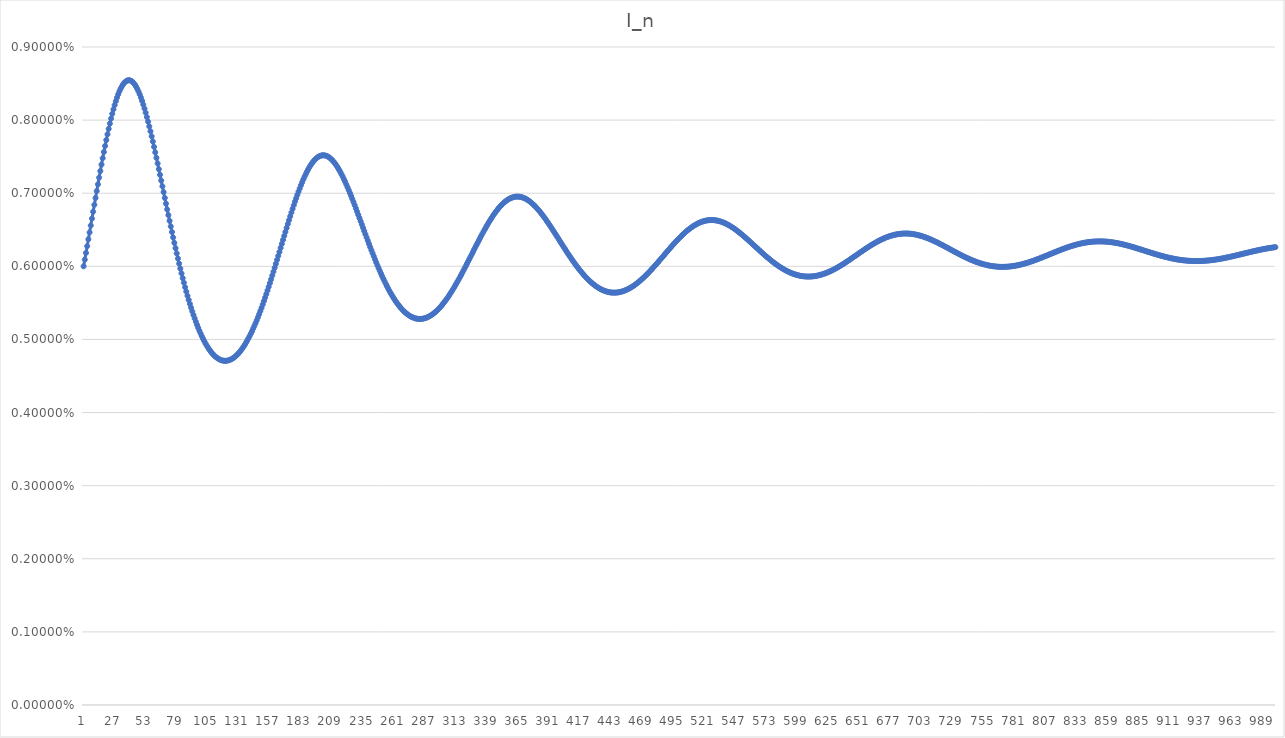
| Category | I_n |
|---|---|
| 0 | 0.006 |
| 1 | 0.006 |
| 2 | 0.006 |
| 3 | 0.006 |
| 4 | 0.006 |
| 5 | 0.006 |
| 6 | 0.007 |
| 7 | 0.007 |
| 8 | 0.007 |
| 9 | 0.007 |
| 10 | 0.007 |
| 11 | 0.007 |
| 12 | 0.007 |
| 13 | 0.007 |
| 14 | 0.007 |
| 15 | 0.007 |
| 16 | 0.007 |
| 17 | 0.008 |
| 18 | 0.008 |
| 19 | 0.008 |
| 20 | 0.008 |
| 21 | 0.008 |
| 22 | 0.008 |
| 23 | 0.008 |
| 24 | 0.008 |
| 25 | 0.008 |
| 26 | 0.008 |
| 27 | 0.008 |
| 28 | 0.008 |
| 29 | 0.008 |
| 30 | 0.008 |
| 31 | 0.008 |
| 32 | 0.008 |
| 33 | 0.008 |
| 34 | 0.009 |
| 35 | 0.009 |
| 36 | 0.009 |
| 37 | 0.009 |
| 38 | 0.009 |
| 39 | 0.009 |
| 40 | 0.009 |
| 41 | 0.009 |
| 42 | 0.009 |
| 43 | 0.008 |
| 44 | 0.008 |
| 45 | 0.008 |
| 46 | 0.008 |
| 47 | 0.008 |
| 48 | 0.008 |
| 49 | 0.008 |
| 50 | 0.008 |
| 51 | 0.008 |
| 52 | 0.008 |
| 53 | 0.008 |
| 54 | 0.008 |
| 55 | 0.008 |
| 56 | 0.008 |
| 57 | 0.008 |
| 58 | 0.008 |
| 59 | 0.008 |
| 60 | 0.008 |
| 61 | 0.007 |
| 62 | 0.007 |
| 63 | 0.007 |
| 64 | 0.007 |
| 65 | 0.007 |
| 66 | 0.007 |
| 67 | 0.007 |
| 68 | 0.007 |
| 69 | 0.007 |
| 70 | 0.007 |
| 71 | 0.007 |
| 72 | 0.007 |
| 73 | 0.007 |
| 74 | 0.006 |
| 75 | 0.006 |
| 76 | 0.006 |
| 77 | 0.006 |
| 78 | 0.006 |
| 79 | 0.006 |
| 80 | 0.006 |
| 81 | 0.006 |
| 82 | 0.006 |
| 83 | 0.006 |
| 84 | 0.006 |
| 85 | 0.006 |
| 86 | 0.006 |
| 87 | 0.006 |
| 88 | 0.006 |
| 89 | 0.005 |
| 90 | 0.005 |
| 91 | 0.005 |
| 92 | 0.005 |
| 93 | 0.005 |
| 94 | 0.005 |
| 95 | 0.005 |
| 96 | 0.005 |
| 97 | 0.005 |
| 98 | 0.005 |
| 99 | 0.005 |
| 100 | 0.005 |
| 101 | 0.005 |
| 102 | 0.005 |
| 103 | 0.005 |
| 104 | 0.005 |
| 105 | 0.005 |
| 106 | 0.005 |
| 107 | 0.005 |
| 108 | 0.005 |
| 109 | 0.005 |
| 110 | 0.005 |
| 111 | 0.005 |
| 112 | 0.005 |
| 113 | 0.005 |
| 114 | 0.005 |
| 115 | 0.005 |
| 116 | 0.005 |
| 117 | 0.005 |
| 118 | 0.005 |
| 119 | 0.005 |
| 120 | 0.005 |
| 121 | 0.005 |
| 122 | 0.005 |
| 123 | 0.005 |
| 124 | 0.005 |
| 125 | 0.005 |
| 126 | 0.005 |
| 127 | 0.005 |
| 128 | 0.005 |
| 129 | 0.005 |
| 130 | 0.005 |
| 131 | 0.005 |
| 132 | 0.005 |
| 133 | 0.005 |
| 134 | 0.005 |
| 135 | 0.005 |
| 136 | 0.005 |
| 137 | 0.005 |
| 138 | 0.005 |
| 139 | 0.005 |
| 140 | 0.005 |
| 141 | 0.005 |
| 142 | 0.005 |
| 143 | 0.005 |
| 144 | 0.005 |
| 145 | 0.005 |
| 146 | 0.005 |
| 147 | 0.005 |
| 148 | 0.005 |
| 149 | 0.005 |
| 150 | 0.005 |
| 151 | 0.006 |
| 152 | 0.006 |
| 153 | 0.006 |
| 154 | 0.006 |
| 155 | 0.006 |
| 156 | 0.006 |
| 157 | 0.006 |
| 158 | 0.006 |
| 159 | 0.006 |
| 160 | 0.006 |
| 161 | 0.006 |
| 162 | 0.006 |
| 163 | 0.006 |
| 164 | 0.006 |
| 165 | 0.006 |
| 166 | 0.006 |
| 167 | 0.006 |
| 168 | 0.006 |
| 169 | 0.006 |
| 170 | 0.007 |
| 171 | 0.007 |
| 172 | 0.007 |
| 173 | 0.007 |
| 174 | 0.007 |
| 175 | 0.007 |
| 176 | 0.007 |
| 177 | 0.007 |
| 178 | 0.007 |
| 179 | 0.007 |
| 180 | 0.007 |
| 181 | 0.007 |
| 182 | 0.007 |
| 183 | 0.007 |
| 184 | 0.007 |
| 185 | 0.007 |
| 186 | 0.007 |
| 187 | 0.007 |
| 188 | 0.007 |
| 189 | 0.007 |
| 190 | 0.007 |
| 191 | 0.007 |
| 192 | 0.007 |
| 193 | 0.007 |
| 194 | 0.007 |
| 195 | 0.007 |
| 196 | 0.007 |
| 197 | 0.008 |
| 198 | 0.008 |
| 199 | 0.008 |
| 200 | 0.008 |
| 201 | 0.008 |
| 202 | 0.008 |
| 203 | 0.008 |
| 204 | 0.008 |
| 205 | 0.007 |
| 206 | 0.007 |
| 207 | 0.007 |
| 208 | 0.007 |
| 209 | 0.007 |
| 210 | 0.007 |
| 211 | 0.007 |
| 212 | 0.007 |
| 213 | 0.007 |
| 214 | 0.007 |
| 215 | 0.007 |
| 216 | 0.007 |
| 217 | 0.007 |
| 218 | 0.007 |
| 219 | 0.007 |
| 220 | 0.007 |
| 221 | 0.007 |
| 222 | 0.007 |
| 223 | 0.007 |
| 224 | 0.007 |
| 225 | 0.007 |
| 226 | 0.007 |
| 227 | 0.007 |
| 228 | 0.007 |
| 229 | 0.007 |
| 230 | 0.007 |
| 231 | 0.007 |
| 232 | 0.007 |
| 233 | 0.007 |
| 234 | 0.007 |
| 235 | 0.006 |
| 236 | 0.006 |
| 237 | 0.006 |
| 238 | 0.006 |
| 239 | 0.006 |
| 240 | 0.006 |
| 241 | 0.006 |
| 242 | 0.006 |
| 243 | 0.006 |
| 244 | 0.006 |
| 245 | 0.006 |
| 246 | 0.006 |
| 247 | 0.006 |
| 248 | 0.006 |
| 249 | 0.006 |
| 250 | 0.006 |
| 251 | 0.006 |
| 252 | 0.006 |
| 253 | 0.006 |
| 254 | 0.006 |
| 255 | 0.006 |
| 256 | 0.006 |
| 257 | 0.006 |
| 258 | 0.006 |
| 259 | 0.006 |
| 260 | 0.006 |
| 261 | 0.006 |
| 262 | 0.006 |
| 263 | 0.005 |
| 264 | 0.005 |
| 265 | 0.005 |
| 266 | 0.005 |
| 267 | 0.005 |
| 268 | 0.005 |
| 269 | 0.005 |
| 270 | 0.005 |
| 271 | 0.005 |
| 272 | 0.005 |
| 273 | 0.005 |
| 274 | 0.005 |
| 275 | 0.005 |
| 276 | 0.005 |
| 277 | 0.005 |
| 278 | 0.005 |
| 279 | 0.005 |
| 280 | 0.005 |
| 281 | 0.005 |
| 282 | 0.005 |
| 283 | 0.005 |
| 284 | 0.005 |
| 285 | 0.005 |
| 286 | 0.005 |
| 287 | 0.005 |
| 288 | 0.005 |
| 289 | 0.005 |
| 290 | 0.005 |
| 291 | 0.005 |
| 292 | 0.005 |
| 293 | 0.005 |
| 294 | 0.005 |
| 295 | 0.005 |
| 296 | 0.005 |
| 297 | 0.005 |
| 298 | 0.005 |
| 299 | 0.005 |
| 300 | 0.005 |
| 301 | 0.005 |
| 302 | 0.006 |
| 303 | 0.006 |
| 304 | 0.006 |
| 305 | 0.006 |
| 306 | 0.006 |
| 307 | 0.006 |
| 308 | 0.006 |
| 309 | 0.006 |
| 310 | 0.006 |
| 311 | 0.006 |
| 312 | 0.006 |
| 313 | 0.006 |
| 314 | 0.006 |
| 315 | 0.006 |
| 316 | 0.006 |
| 317 | 0.006 |
| 318 | 0.006 |
| 319 | 0.006 |
| 320 | 0.006 |
| 321 | 0.006 |
| 322 | 0.006 |
| 323 | 0.006 |
| 324 | 0.006 |
| 325 | 0.006 |
| 326 | 0.006 |
| 327 | 0.006 |
| 328 | 0.006 |
| 329 | 0.006 |
| 330 | 0.006 |
| 331 | 0.006 |
| 332 | 0.006 |
| 333 | 0.006 |
| 334 | 0.006 |
| 335 | 0.006 |
| 336 | 0.007 |
| 337 | 0.007 |
| 338 | 0.007 |
| 339 | 0.007 |
| 340 | 0.007 |
| 341 | 0.007 |
| 342 | 0.007 |
| 343 | 0.007 |
| 344 | 0.007 |
| 345 | 0.007 |
| 346 | 0.007 |
| 347 | 0.007 |
| 348 | 0.007 |
| 349 | 0.007 |
| 350 | 0.007 |
| 351 | 0.007 |
| 352 | 0.007 |
| 353 | 0.007 |
| 354 | 0.007 |
| 355 | 0.007 |
| 356 | 0.007 |
| 357 | 0.007 |
| 358 | 0.007 |
| 359 | 0.007 |
| 360 | 0.007 |
| 361 | 0.007 |
| 362 | 0.007 |
| 363 | 0.007 |
| 364 | 0.007 |
| 365 | 0.007 |
| 366 | 0.007 |
| 367 | 0.007 |
| 368 | 0.007 |
| 369 | 0.007 |
| 370 | 0.007 |
| 371 | 0.007 |
| 372 | 0.007 |
| 373 | 0.007 |
| 374 | 0.007 |
| 375 | 0.007 |
| 376 | 0.007 |
| 377 | 0.007 |
| 378 | 0.007 |
| 379 | 0.007 |
| 380 | 0.007 |
| 381 | 0.007 |
| 382 | 0.007 |
| 383 | 0.007 |
| 384 | 0.007 |
| 385 | 0.007 |
| 386 | 0.007 |
| 387 | 0.007 |
| 388 | 0.007 |
| 389 | 0.007 |
| 390 | 0.007 |
| 391 | 0.007 |
| 392 | 0.007 |
| 393 | 0.006 |
| 394 | 0.006 |
| 395 | 0.006 |
| 396 | 0.006 |
| 397 | 0.006 |
| 398 | 0.006 |
| 399 | 0.006 |
| 400 | 0.006 |
| 401 | 0.006 |
| 402 | 0.006 |
| 403 | 0.006 |
| 404 | 0.006 |
| 405 | 0.006 |
| 406 | 0.006 |
| 407 | 0.006 |
| 408 | 0.006 |
| 409 | 0.006 |
| 410 | 0.006 |
| 411 | 0.006 |
| 412 | 0.006 |
| 413 | 0.006 |
| 414 | 0.006 |
| 415 | 0.006 |
| 416 | 0.006 |
| 417 | 0.006 |
| 418 | 0.006 |
| 419 | 0.006 |
| 420 | 0.006 |
| 421 | 0.006 |
| 422 | 0.006 |
| 423 | 0.006 |
| 424 | 0.006 |
| 425 | 0.006 |
| 426 | 0.006 |
| 427 | 0.006 |
| 428 | 0.006 |
| 429 | 0.006 |
| 430 | 0.006 |
| 431 | 0.006 |
| 432 | 0.006 |
| 433 | 0.006 |
| 434 | 0.006 |
| 435 | 0.006 |
| 436 | 0.006 |
| 437 | 0.006 |
| 438 | 0.006 |
| 439 | 0.006 |
| 440 | 0.006 |
| 441 | 0.006 |
| 442 | 0.006 |
| 443 | 0.006 |
| 444 | 0.006 |
| 445 | 0.006 |
| 446 | 0.006 |
| 447 | 0.006 |
| 448 | 0.006 |
| 449 | 0.006 |
| 450 | 0.006 |
| 451 | 0.006 |
| 452 | 0.006 |
| 453 | 0.006 |
| 454 | 0.006 |
| 455 | 0.006 |
| 456 | 0.006 |
| 457 | 0.006 |
| 458 | 0.006 |
| 459 | 0.006 |
| 460 | 0.006 |
| 461 | 0.006 |
| 462 | 0.006 |
| 463 | 0.006 |
| 464 | 0.006 |
| 465 | 0.006 |
| 466 | 0.006 |
| 467 | 0.006 |
| 468 | 0.006 |
| 469 | 0.006 |
| 470 | 0.006 |
| 471 | 0.006 |
| 472 | 0.006 |
| 473 | 0.006 |
| 474 | 0.006 |
| 475 | 0.006 |
| 476 | 0.006 |
| 477 | 0.006 |
| 478 | 0.006 |
| 479 | 0.006 |
| 480 | 0.006 |
| 481 | 0.006 |
| 482 | 0.006 |
| 483 | 0.006 |
| 484 | 0.006 |
| 485 | 0.006 |
| 486 | 0.006 |
| 487 | 0.006 |
| 488 | 0.006 |
| 489 | 0.006 |
| 490 | 0.006 |
| 491 | 0.006 |
| 492 | 0.006 |
| 493 | 0.006 |
| 494 | 0.006 |
| 495 | 0.006 |
| 496 | 0.006 |
| 497 | 0.006 |
| 498 | 0.006 |
| 499 | 0.006 |
| 500 | 0.006 |
| 501 | 0.006 |
| 502 | 0.006 |
| 503 | 0.006 |
| 504 | 0.006 |
| 505 | 0.006 |
| 506 | 0.006 |
| 507 | 0.007 |
| 508 | 0.007 |
| 509 | 0.007 |
| 510 | 0.007 |
| 511 | 0.007 |
| 512 | 0.007 |
| 513 | 0.007 |
| 514 | 0.007 |
| 515 | 0.007 |
| 516 | 0.007 |
| 517 | 0.007 |
| 518 | 0.007 |
| 519 | 0.007 |
| 520 | 0.007 |
| 521 | 0.007 |
| 522 | 0.007 |
| 523 | 0.007 |
| 524 | 0.007 |
| 525 | 0.007 |
| 526 | 0.007 |
| 527 | 0.007 |
| 528 | 0.007 |
| 529 | 0.007 |
| 530 | 0.007 |
| 531 | 0.007 |
| 532 | 0.007 |
| 533 | 0.007 |
| 534 | 0.007 |
| 535 | 0.007 |
| 536 | 0.007 |
| 537 | 0.007 |
| 538 | 0.007 |
| 539 | 0.007 |
| 540 | 0.007 |
| 541 | 0.007 |
| 542 | 0.007 |
| 543 | 0.007 |
| 544 | 0.007 |
| 545 | 0.007 |
| 546 | 0.007 |
| 547 | 0.006 |
| 548 | 0.006 |
| 549 | 0.006 |
| 550 | 0.006 |
| 551 | 0.006 |
| 552 | 0.006 |
| 553 | 0.006 |
| 554 | 0.006 |
| 555 | 0.006 |
| 556 | 0.006 |
| 557 | 0.006 |
| 558 | 0.006 |
| 559 | 0.006 |
| 560 | 0.006 |
| 561 | 0.006 |
| 562 | 0.006 |
| 563 | 0.006 |
| 564 | 0.006 |
| 565 | 0.006 |
| 566 | 0.006 |
| 567 | 0.006 |
| 568 | 0.006 |
| 569 | 0.006 |
| 570 | 0.006 |
| 571 | 0.006 |
| 572 | 0.006 |
| 573 | 0.006 |
| 574 | 0.006 |
| 575 | 0.006 |
| 576 | 0.006 |
| 577 | 0.006 |
| 578 | 0.006 |
| 579 | 0.006 |
| 580 | 0.006 |
| 581 | 0.006 |
| 582 | 0.006 |
| 583 | 0.006 |
| 584 | 0.006 |
| 585 | 0.006 |
| 586 | 0.006 |
| 587 | 0.006 |
| 588 | 0.006 |
| 589 | 0.006 |
| 590 | 0.006 |
| 591 | 0.006 |
| 592 | 0.006 |
| 593 | 0.006 |
| 594 | 0.006 |
| 595 | 0.006 |
| 596 | 0.006 |
| 597 | 0.006 |
| 598 | 0.006 |
| 599 | 0.006 |
| 600 | 0.006 |
| 601 | 0.006 |
| 602 | 0.006 |
| 603 | 0.006 |
| 604 | 0.006 |
| 605 | 0.006 |
| 606 | 0.006 |
| 607 | 0.006 |
| 608 | 0.006 |
| 609 | 0.006 |
| 610 | 0.006 |
| 611 | 0.006 |
| 612 | 0.006 |
| 613 | 0.006 |
| 614 | 0.006 |
| 615 | 0.006 |
| 616 | 0.006 |
| 617 | 0.006 |
| 618 | 0.006 |
| 619 | 0.006 |
| 620 | 0.006 |
| 621 | 0.006 |
| 622 | 0.006 |
| 623 | 0.006 |
| 624 | 0.006 |
| 625 | 0.006 |
| 626 | 0.006 |
| 627 | 0.006 |
| 628 | 0.006 |
| 629 | 0.006 |
| 630 | 0.006 |
| 631 | 0.006 |
| 632 | 0.006 |
| 633 | 0.006 |
| 634 | 0.006 |
| 635 | 0.006 |
| 636 | 0.006 |
| 637 | 0.006 |
| 638 | 0.006 |
| 639 | 0.006 |
| 640 | 0.006 |
| 641 | 0.006 |
| 642 | 0.006 |
| 643 | 0.006 |
| 644 | 0.006 |
| 645 | 0.006 |
| 646 | 0.006 |
| 647 | 0.006 |
| 648 | 0.006 |
| 649 | 0.006 |
| 650 | 0.006 |
| 651 | 0.006 |
| 652 | 0.006 |
| 653 | 0.006 |
| 654 | 0.006 |
| 655 | 0.006 |
| 656 | 0.006 |
| 657 | 0.006 |
| 658 | 0.006 |
| 659 | 0.006 |
| 660 | 0.006 |
| 661 | 0.006 |
| 662 | 0.006 |
| 663 | 0.006 |
| 664 | 0.006 |
| 665 | 0.006 |
| 666 | 0.006 |
| 667 | 0.006 |
| 668 | 0.006 |
| 669 | 0.006 |
| 670 | 0.006 |
| 671 | 0.006 |
| 672 | 0.006 |
| 673 | 0.006 |
| 674 | 0.006 |
| 675 | 0.006 |
| 676 | 0.006 |
| 677 | 0.006 |
| 678 | 0.006 |
| 679 | 0.006 |
| 680 | 0.006 |
| 681 | 0.006 |
| 682 | 0.006 |
| 683 | 0.006 |
| 684 | 0.006 |
| 685 | 0.006 |
| 686 | 0.006 |
| 687 | 0.006 |
| 688 | 0.006 |
| 689 | 0.006 |
| 690 | 0.006 |
| 691 | 0.006 |
| 692 | 0.006 |
| 693 | 0.006 |
| 694 | 0.006 |
| 695 | 0.006 |
| 696 | 0.006 |
| 697 | 0.006 |
| 698 | 0.006 |
| 699 | 0.006 |
| 700 | 0.006 |
| 701 | 0.006 |
| 702 | 0.006 |
| 703 | 0.006 |
| 704 | 0.006 |
| 705 | 0.006 |
| 706 | 0.006 |
| 707 | 0.006 |
| 708 | 0.006 |
| 709 | 0.006 |
| 710 | 0.006 |
| 711 | 0.006 |
| 712 | 0.006 |
| 713 | 0.006 |
| 714 | 0.006 |
| 715 | 0.006 |
| 716 | 0.006 |
| 717 | 0.006 |
| 718 | 0.006 |
| 719 | 0.006 |
| 720 | 0.006 |
| 721 | 0.006 |
| 722 | 0.006 |
| 723 | 0.006 |
| 724 | 0.006 |
| 725 | 0.006 |
| 726 | 0.006 |
| 727 | 0.006 |
| 728 | 0.006 |
| 729 | 0.006 |
| 730 | 0.006 |
| 731 | 0.006 |
| 732 | 0.006 |
| 733 | 0.006 |
| 734 | 0.006 |
| 735 | 0.006 |
| 736 | 0.006 |
| 737 | 0.006 |
| 738 | 0.006 |
| 739 | 0.006 |
| 740 | 0.006 |
| 741 | 0.006 |
| 742 | 0.006 |
| 743 | 0.006 |
| 744 | 0.006 |
| 745 | 0.006 |
| 746 | 0.006 |
| 747 | 0.006 |
| 748 | 0.006 |
| 749 | 0.006 |
| 750 | 0.006 |
| 751 | 0.006 |
| 752 | 0.006 |
| 753 | 0.006 |
| 754 | 0.006 |
| 755 | 0.006 |
| 756 | 0.006 |
| 757 | 0.006 |
| 758 | 0.006 |
| 759 | 0.006 |
| 760 | 0.006 |
| 761 | 0.006 |
| 762 | 0.006 |
| 763 | 0.006 |
| 764 | 0.006 |
| 765 | 0.006 |
| 766 | 0.006 |
| 767 | 0.006 |
| 768 | 0.006 |
| 769 | 0.006 |
| 770 | 0.006 |
| 771 | 0.006 |
| 772 | 0.006 |
| 773 | 0.006 |
| 774 | 0.006 |
| 775 | 0.006 |
| 776 | 0.006 |
| 777 | 0.006 |
| 778 | 0.006 |
| 779 | 0.006 |
| 780 | 0.006 |
| 781 | 0.006 |
| 782 | 0.006 |
| 783 | 0.006 |
| 784 | 0.006 |
| 785 | 0.006 |
| 786 | 0.006 |
| 787 | 0.006 |
| 788 | 0.006 |
| 789 | 0.006 |
| 790 | 0.006 |
| 791 | 0.006 |
| 792 | 0.006 |
| 793 | 0.006 |
| 794 | 0.006 |
| 795 | 0.006 |
| 796 | 0.006 |
| 797 | 0.006 |
| 798 | 0.006 |
| 799 | 0.006 |
| 800 | 0.006 |
| 801 | 0.006 |
| 802 | 0.006 |
| 803 | 0.006 |
| 804 | 0.006 |
| 805 | 0.006 |
| 806 | 0.006 |
| 807 | 0.006 |
| 808 | 0.006 |
| 809 | 0.006 |
| 810 | 0.006 |
| 811 | 0.006 |
| 812 | 0.006 |
| 813 | 0.006 |
| 814 | 0.006 |
| 815 | 0.006 |
| 816 | 0.006 |
| 817 | 0.006 |
| 818 | 0.006 |
| 819 | 0.006 |
| 820 | 0.006 |
| 821 | 0.006 |
| 822 | 0.006 |
| 823 | 0.006 |
| 824 | 0.006 |
| 825 | 0.006 |
| 826 | 0.006 |
| 827 | 0.006 |
| 828 | 0.006 |
| 829 | 0.006 |
| 830 | 0.006 |
| 831 | 0.006 |
| 832 | 0.006 |
| 833 | 0.006 |
| 834 | 0.006 |
| 835 | 0.006 |
| 836 | 0.006 |
| 837 | 0.006 |
| 838 | 0.006 |
| 839 | 0.006 |
| 840 | 0.006 |
| 841 | 0.006 |
| 842 | 0.006 |
| 843 | 0.006 |
| 844 | 0.006 |
| 845 | 0.006 |
| 846 | 0.006 |
| 847 | 0.006 |
| 848 | 0.006 |
| 849 | 0.006 |
| 850 | 0.006 |
| 851 | 0.006 |
| 852 | 0.006 |
| 853 | 0.006 |
| 854 | 0.006 |
| 855 | 0.006 |
| 856 | 0.006 |
| 857 | 0.006 |
| 858 | 0.006 |
| 859 | 0.006 |
| 860 | 0.006 |
| 861 | 0.006 |
| 862 | 0.006 |
| 863 | 0.006 |
| 864 | 0.006 |
| 865 | 0.006 |
| 866 | 0.006 |
| 867 | 0.006 |
| 868 | 0.006 |
| 869 | 0.006 |
| 870 | 0.006 |
| 871 | 0.006 |
| 872 | 0.006 |
| 873 | 0.006 |
| 874 | 0.006 |
| 875 | 0.006 |
| 876 | 0.006 |
| 877 | 0.006 |
| 878 | 0.006 |
| 879 | 0.006 |
| 880 | 0.006 |
| 881 | 0.006 |
| 882 | 0.006 |
| 883 | 0.006 |
| 884 | 0.006 |
| 885 | 0.006 |
| 886 | 0.006 |
| 887 | 0.006 |
| 888 | 0.006 |
| 889 | 0.006 |
| 890 | 0.006 |
| 891 | 0.006 |
| 892 | 0.006 |
| 893 | 0.006 |
| 894 | 0.006 |
| 895 | 0.006 |
| 896 | 0.006 |
| 897 | 0.006 |
| 898 | 0.006 |
| 899 | 0.006 |
| 900 | 0.006 |
| 901 | 0.006 |
| 902 | 0.006 |
| 903 | 0.006 |
| 904 | 0.006 |
| 905 | 0.006 |
| 906 | 0.006 |
| 907 | 0.006 |
| 908 | 0.006 |
| 909 | 0.006 |
| 910 | 0.006 |
| 911 | 0.006 |
| 912 | 0.006 |
| 913 | 0.006 |
| 914 | 0.006 |
| 915 | 0.006 |
| 916 | 0.006 |
| 917 | 0.006 |
| 918 | 0.006 |
| 919 | 0.006 |
| 920 | 0.006 |
| 921 | 0.006 |
| 922 | 0.006 |
| 923 | 0.006 |
| 924 | 0.006 |
| 925 | 0.006 |
| 926 | 0.006 |
| 927 | 0.006 |
| 928 | 0.006 |
| 929 | 0.006 |
| 930 | 0.006 |
| 931 | 0.006 |
| 932 | 0.006 |
| 933 | 0.006 |
| 934 | 0.006 |
| 935 | 0.006 |
| 936 | 0.006 |
| 937 | 0.006 |
| 938 | 0.006 |
| 939 | 0.006 |
| 940 | 0.006 |
| 941 | 0.006 |
| 942 | 0.006 |
| 943 | 0.006 |
| 944 | 0.006 |
| 945 | 0.006 |
| 946 | 0.006 |
| 947 | 0.006 |
| 948 | 0.006 |
| 949 | 0.006 |
| 950 | 0.006 |
| 951 | 0.006 |
| 952 | 0.006 |
| 953 | 0.006 |
| 954 | 0.006 |
| 955 | 0.006 |
| 956 | 0.006 |
| 957 | 0.006 |
| 958 | 0.006 |
| 959 | 0.006 |
| 960 | 0.006 |
| 961 | 0.006 |
| 962 | 0.006 |
| 963 | 0.006 |
| 964 | 0.006 |
| 965 | 0.006 |
| 966 | 0.006 |
| 967 | 0.006 |
| 968 | 0.006 |
| 969 | 0.006 |
| 970 | 0.006 |
| 971 | 0.006 |
| 972 | 0.006 |
| 973 | 0.006 |
| 974 | 0.006 |
| 975 | 0.006 |
| 976 | 0.006 |
| 977 | 0.006 |
| 978 | 0.006 |
| 979 | 0.006 |
| 980 | 0.006 |
| 981 | 0.006 |
| 982 | 0.006 |
| 983 | 0.006 |
| 984 | 0.006 |
| 985 | 0.006 |
| 986 | 0.006 |
| 987 | 0.006 |
| 988 | 0.006 |
| 989 | 0.006 |
| 990 | 0.006 |
| 991 | 0.006 |
| 992 | 0.006 |
| 993 | 0.006 |
| 994 | 0.006 |
| 995 | 0.006 |
| 996 | 0.006 |
| 997 | 0.006 |
| 998 | 0.006 |